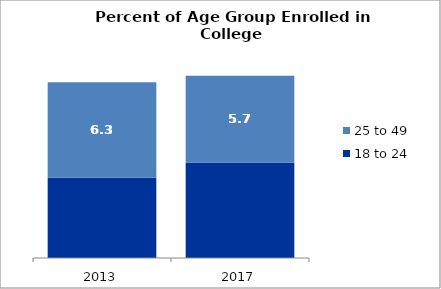
| Category | 18 to 24 | 25 to 49 |
|---|---|---|
| 2013.0 | 37.296 | 6.317 |
| 2017.0 | 38.313 | 5.722 |